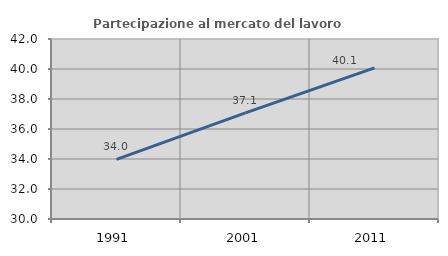
| Category | Partecipazione al mercato del lavoro  femminile |
|---|---|
| 1991.0 | 33.975 |
| 2001.0 | 37.071 |
| 2011.0 | 40.079 |